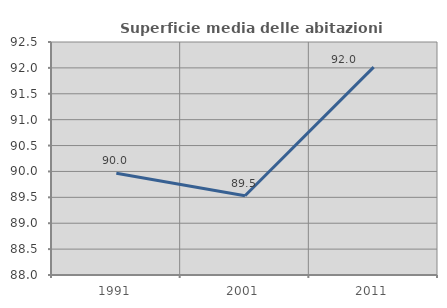
| Category | Superficie media delle abitazioni occupate |
|---|---|
| 1991.0 | 89.966 |
| 2001.0 | 89.531 |
| 2011.0 | 92.015 |